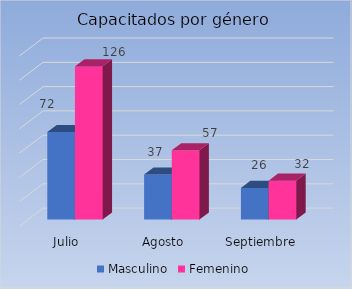
| Category | Masculino | Femenino |
|---|---|---|
| Julio | 72 | 126 |
| Agosto | 37 | 57 |
| Septiembre | 26 | 32 |